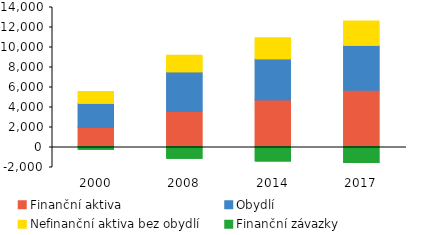
| Category | Finanční aktiva | Obydlí | Nefinanční aktiva bez obydlí | Finanční závazky |
|---|---|---|---|---|
| 2000.0 | 1932.695 | 2385.693 | 1179.327 | -274.068 |
| 2008.0 | 3536.295 | 3931.946 | 1666.643 | -1174.134 |
| 2014.0 | 4684.402 | 4088.275 | 2091.701 | -1438.405 |
| 2017.0 | 5646.925 | 4478.417 | 2430.736 | -1604.79 |